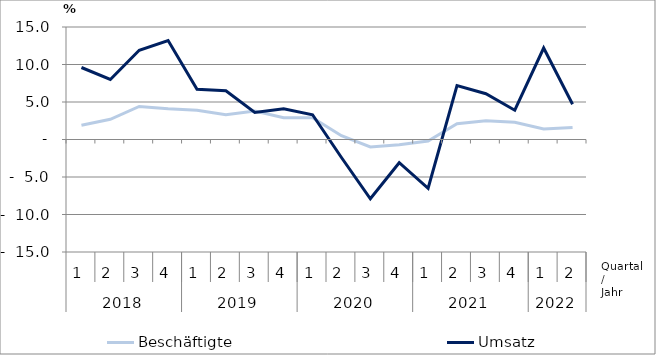
| Category | Beschäftigte | Umsatz |
|---|---|---|
| 0 | 1.9 | 9.6 |
| 1 | 2.7 | 8 |
| 2 | 4.4 | 11.9 |
| 3 | 4.1 | 13.2 |
| 4 | 3.9 | 6.7 |
| 5 | 3.3 | 6.5 |
| 6 | 3.8 | 3.6 |
| 7 | 2.9 | 4.1 |
| 8 | 2.9 | 3.3 |
| 9 | 0.5 | -2.4 |
| 10 | -1 | -7.9 |
| 11 | -0.7 | -3.1 |
| 12 | -0.2 | -6.5 |
| 13 | 2.1 | 7.2 |
| 14 | 2.5 | 6.1 |
| 15 | 2.3 | 3.9 |
| 16 | 1.4 | 12.2 |
| 17 | 1.6 | 4.7 |